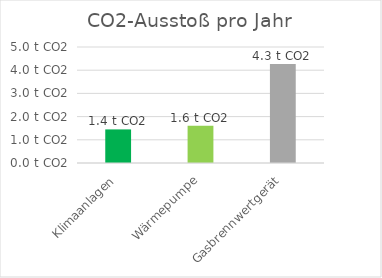
| Category | Series 0 |
|---|---|
| Klimaanlagen | 1.448 |
| Wärmepumpe | 1.608 |
| Gasbrennwertgerät | 4.272 |